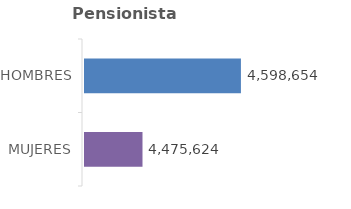
| Category | Series 0 | Series 1 |
|---|---|---|
| MUJERES | 4475624 |  |
| HOMBRES | 4598654 |  |